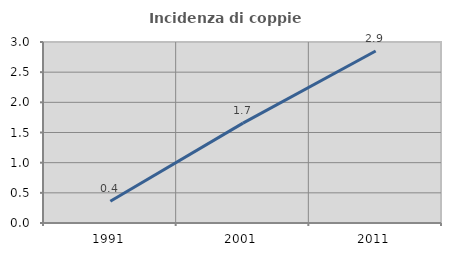
| Category | Incidenza di coppie miste |
|---|---|
| 1991.0 | 0.361 |
| 2001.0 | 1.655 |
| 2011.0 | 2.85 |